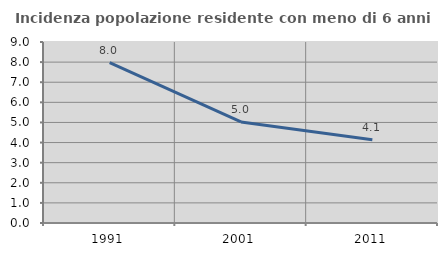
| Category | Incidenza popolazione residente con meno di 6 anni |
|---|---|
| 1991.0 | 7.973 |
| 2001.0 | 5.023 |
| 2011.0 | 4.143 |